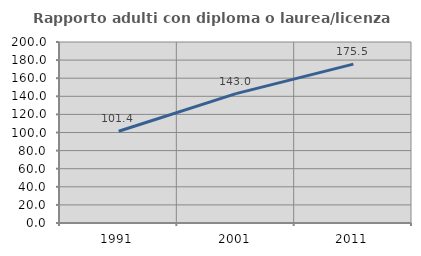
| Category | Rapporto adulti con diploma o laurea/licenza media  |
|---|---|
| 1991.0 | 101.408 |
| 2001.0 | 142.958 |
| 2011.0 | 175.543 |